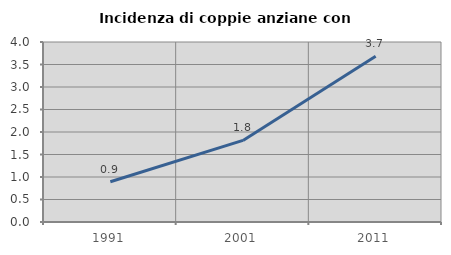
| Category | Incidenza di coppie anziane con figli |
|---|---|
| 1991.0 | 0.896 |
| 2001.0 | 1.813 |
| 2011.0 | 3.681 |